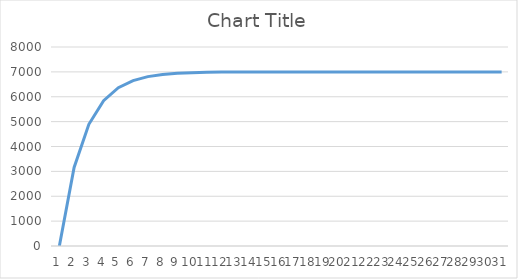
| Category | Series 0 |
|---|---|
| 0 | 0 |
| 1 | 3158.319 |
| 2 | 4891.641 |
| 3 | 5842.908 |
| 4 | 6364.974 |
| 5 | 6651.491 |
| 6 | 6808.734 |
| 7 | 6895.031 |
| 8 | 6942.392 |
| 9 | 6968.384 |
| 10 | 6982.649 |
| 11 | 6990.477 |
| 12 | 6994.774 |
| 13 | 6997.132 |
| 14 | 6998.426 |
| 15 | 6999.136 |
| 16 | 6999.526 |
| 17 | 6999.74 |
| 18 | 6999.857 |
| 19 | 6999.922 |
| 20 | 6999.957 |
| 21 | 6999.976 |
| 22 | 6999.987 |
| 23 | 6999.993 |
| 24 | 6999.996 |
| 25 | 6999.998 |
| 26 | 6999.999 |
| 27 | 6999.999 |
| 28 | 7000 |
| 29 | 7000 |
| 30 | 7000 |